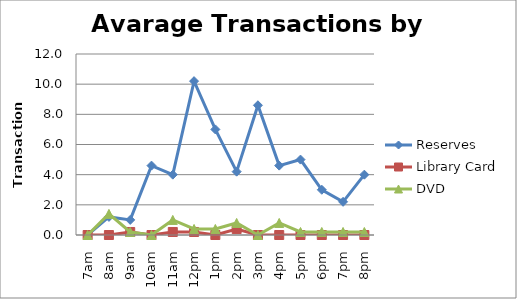
| Category | Reserves | Library Card | DVD |
|---|---|---|---|
| 7am | 0 | 0 | 0 |
| 8am | 1.2 | 0 | 1.4 |
| 9am | 1 | 0.2 | 0.2 |
| 10am | 4.6 | 0 | 0 |
| 11am | 4 | 0.2 | 1 |
| 12pm | 10.2 | 0.2 | 0.4 |
| 1pm | 7 | 0 | 0.4 |
| 2pm | 4.2 | 0.4 | 0.8 |
| 3pm | 8.6 | 0 | 0 |
| 4pm | 4.6 | 0 | 0.8 |
| 5pm | 5 | 0 | 0.2 |
| 6pm | 3 | 0 | 0.2 |
| 7pm | 2.2 | 0 | 0.2 |
| 8pm | 4 | 0 | 0.2 |